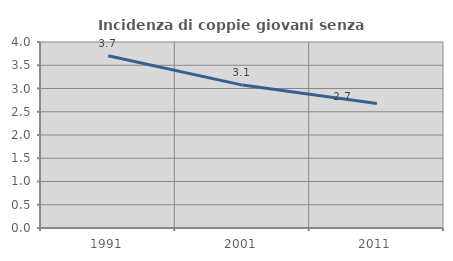
| Category | Incidenza di coppie giovani senza figli |
|---|---|
| 1991.0 | 3.704 |
| 2001.0 | 3.073 |
| 2011.0 | 2.678 |